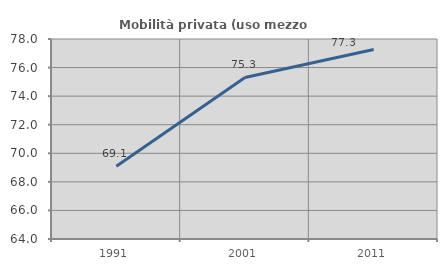
| Category | Mobilità privata (uso mezzo privato) |
|---|---|
| 1991.0 | 69.093 |
| 2001.0 | 75.31 |
| 2011.0 | 77.264 |